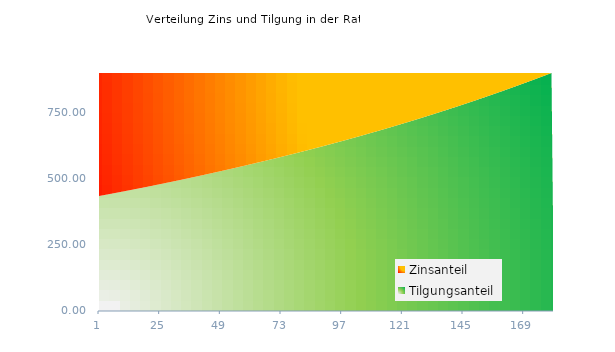
| Category | Tilgungsanteil | Zinsanteil |
|---|---|---|
| 0 | 434.25 | 468.524 |
| 1 | 436.019 | 466.755 |
| 2 | 437.795 | 464.979 |
| 3 | 439.579 | 463.195 |
| 4 | 441.37 | 461.404 |
| 5 | 443.168 | 459.606 |
| 6 | 444.974 | 457.8 |
| 7 | 446.786 | 455.988 |
| 8 | 448.607 | 454.167 |
| 9 | 450.434 | 452.34 |
| 10 | 452.269 | 450.504 |
| 11 | 454.112 | 448.662 |
| 12 | 455.962 | 446.812 |
| 13 | 457.82 | 444.954 |
| 14 | 459.685 | 443.089 |
| 15 | 461.558 | 441.216 |
| 16 | 463.438 | 439.336 |
| 17 | 465.326 | 437.448 |
| 18 | 467.222 | 435.552 |
| 19 | 469.126 | 433.648 |
| 20 | 471.037 | 431.737 |
| 21 | 472.956 | 429.818 |
| 22 | 474.883 | 427.891 |
| 23 | 476.818 | 425.956 |
| 24 | 478.76 | 424.014 |
| 25 | 480.711 | 422.063 |
| 26 | 482.669 | 420.105 |
| 27 | 484.636 | 418.138 |
| 28 | 486.61 | 416.164 |
| 29 | 488.593 | 414.181 |
| 30 | 490.583 | 412.191 |
| 31 | 492.582 | 410.192 |
| 32 | 494.589 | 408.185 |
| 33 | 496.604 | 406.17 |
| 34 | 498.627 | 404.147 |
| 35 | 500.659 | 402.115 |
| 36 | 502.698 | 400.076 |
| 37 | 504.746 | 398.028 |
| 38 | 506.803 | 395.971 |
| 39 | 508.868 | 393.906 |
| 40 | 510.941 | 391.833 |
| 41 | 513.022 | 389.752 |
| 42 | 515.112 | 387.661 |
| 43 | 517.211 | 385.563 |
| 44 | 519.318 | 383.456 |
| 45 | 521.434 | 381.34 |
| 46 | 523.558 | 379.215 |
| 47 | 525.691 | 377.082 |
| 48 | 527.833 | 374.941 |
| 49 | 529.984 | 372.79 |
| 50 | 532.143 | 370.631 |
| 51 | 534.311 | 368.463 |
| 52 | 536.488 | 366.286 |
| 53 | 538.673 | 364.1 |
| 54 | 540.868 | 361.906 |
| 55 | 543.072 | 359.702 |
| 56 | 545.284 | 357.49 |
| 57 | 547.506 | 355.268 |
| 58 | 549.736 | 353.038 |
| 59 | 551.976 | 350.798 |
| 60 | 554.225 | 348.549 |
| 61 | 556.483 | 346.291 |
| 62 | 558.75 | 344.024 |
| 63 | 561.026 | 341.747 |
| 64 | 563.312 | 339.462 |
| 65 | 565.607 | 337.167 |
| 66 | 567.912 | 334.862 |
| 67 | 570.225 | 332.549 |
| 68 | 572.548 | 330.226 |
| 69 | 574.881 | 327.893 |
| 70 | 577.223 | 325.551 |
| 71 | 579.575 | 323.199 |
| 72 | 581.936 | 320.838 |
| 73 | 584.307 | 318.467 |
| 74 | 586.688 | 316.086 |
| 75 | 589.078 | 313.696 |
| 76 | 591.478 | 311.296 |
| 77 | 593.888 | 308.886 |
| 78 | 596.307 | 306.467 |
| 79 | 598.737 | 304.037 |
| 80 | 601.176 | 301.598 |
| 81 | 603.625 | 299.149 |
| 82 | 606.084 | 296.69 |
| 83 | 608.554 | 294.22 |
| 84 | 611.033 | 291.741 |
| 85 | 613.522 | 289.252 |
| 86 | 616.022 | 286.752 |
| 87 | 618.532 | 284.242 |
| 88 | 621.052 | 281.722 |
| 89 | 623.582 | 279.192 |
| 90 | 626.122 | 276.651 |
| 91 | 628.673 | 274.101 |
| 92 | 631.235 | 271.539 |
| 93 | 633.806 | 268.968 |
| 94 | 636.389 | 266.385 |
| 95 | 638.981 | 263.793 |
| 96 | 641.585 | 261.189 |
| 97 | 644.198 | 258.575 |
| 98 | 646.823 | 255.951 |
| 99 | 649.458 | 253.316 |
| 100 | 652.104 | 250.67 |
| 101 | 654.761 | 248.013 |
| 102 | 657.429 | 245.345 |
| 103 | 660.107 | 242.667 |
| 104 | 662.796 | 239.978 |
| 105 | 665.497 | 237.277 |
| 106 | 668.208 | 234.566 |
| 107 | 670.93 | 231.844 |
| 108 | 673.664 | 229.11 |
| 109 | 676.408 | 226.366 |
| 110 | 679.164 | 223.61 |
| 111 | 681.931 | 220.843 |
| 112 | 684.709 | 218.064 |
| 113 | 687.499 | 215.275 |
| 114 | 690.3 | 212.474 |
| 115 | 693.112 | 209.662 |
| 116 | 695.936 | 206.838 |
| 117 | 698.772 | 204.002 |
| 118 | 701.618 | 201.156 |
| 119 | 704.477 | 198.297 |
| 120 | 707.347 | 195.427 |
| 121 | 710.229 | 192.545 |
| 122 | 713.122 | 189.652 |
| 123 | 716.028 | 186.746 |
| 124 | 718.945 | 183.829 |
| 125 | 721.874 | 180.9 |
| 126 | 724.815 | 177.959 |
| 127 | 727.768 | 175.006 |
| 128 | 730.733 | 172.041 |
| 129 | 733.71 | 169.064 |
| 130 | 736.699 | 166.075 |
| 131 | 739.701 | 163.073 |
| 132 | 742.714 | 160.06 |
| 133 | 745.74 | 157.034 |
| 134 | 748.778 | 153.995 |
| 135 | 751.829 | 150.945 |
| 136 | 754.892 | 147.882 |
| 137 | 757.968 | 144.806 |
| 138 | 761.056 | 141.718 |
| 139 | 764.156 | 138.618 |
| 140 | 767.27 | 135.504 |
| 141 | 770.396 | 132.378 |
| 142 | 773.534 | 129.24 |
| 143 | 776.686 | 126.088 |
| 144 | 779.85 | 122.924 |
| 145 | 783.027 | 119.747 |
| 146 | 786.217 | 116.557 |
| 147 | 789.421 | 113.353 |
| 148 | 792.637 | 110.137 |
| 149 | 795.866 | 106.908 |
| 150 | 799.109 | 103.665 |
| 151 | 802.364 | 100.41 |
| 152 | 805.633 | 97.141 |
| 153 | 808.915 | 93.859 |
| 154 | 812.211 | 90.563 |
| 155 | 815.52 | 87.254 |
| 156 | 818.843 | 83.931 |
| 157 | 822.179 | 80.595 |
| 158 | 825.528 | 77.246 |
| 159 | 828.892 | 73.882 |
| 160 | 832.269 | 70.505 |
| 161 | 835.659 | 67.115 |
| 162 | 839.064 | 63.71 |
| 163 | 842.482 | 60.292 |
| 164 | 845.915 | 56.859 |
| 165 | 849.361 | 53.413 |
| 166 | 852.822 | 49.952 |
| 167 | 856.296 | 46.478 |
| 168 | 859.785 | 42.989 |
| 169 | 863.288 | 39.486 |
| 170 | 866.805 | 35.969 |
| 171 | 870.336 | 32.438 |
| 172 | 873.882 | 28.892 |
| 173 | 877.442 | 25.332 |
| 174 | 881.017 | 21.757 |
| 175 | 884.607 | 18.167 |
| 176 | 888.211 | 14.563 |
| 177 | 891.829 | 10.945 |
| 178 | 895.463 | 7.311 |
| 179 | 899.111 | 3.663 |
| 180 | 0 | 0 |